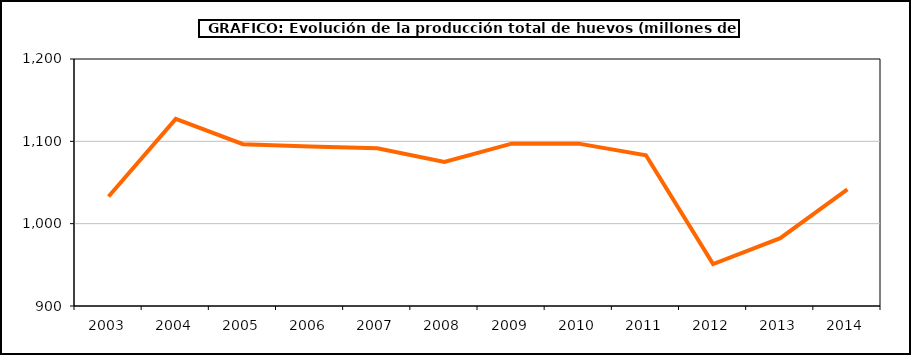
| Category | huevos |
|---|---|
| 2003.0 | 1033 |
| 2004.0 | 1127.271 |
| 2005.0 | 1096.54 |
| 2006.0 | 1093.721 |
| 2007.0 | 1091.465 |
| 2008.0 | 1074.834 |
| 2009.0 | 1097.178 |
| 2010.0 | 1097.2 |
| 2011.0 | 1083.082 |
| 2012.0 | 950.879 |
| 2013.0 | 982.375 |
| 2014.0 | 1041.522 |